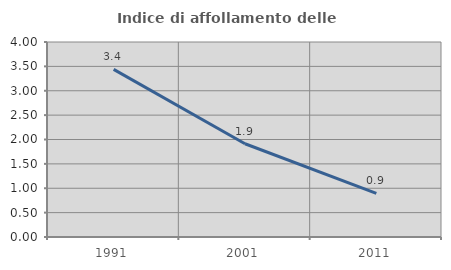
| Category | Indice di affollamento delle abitazioni  |
|---|---|
| 1991.0 | 3.439 |
| 2001.0 | 1.913 |
| 2011.0 | 0.895 |